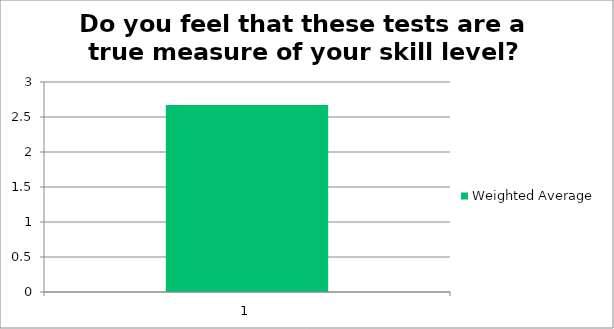
| Category | Weighted Average |
|---|---|
| 1.0 | 2.67 |